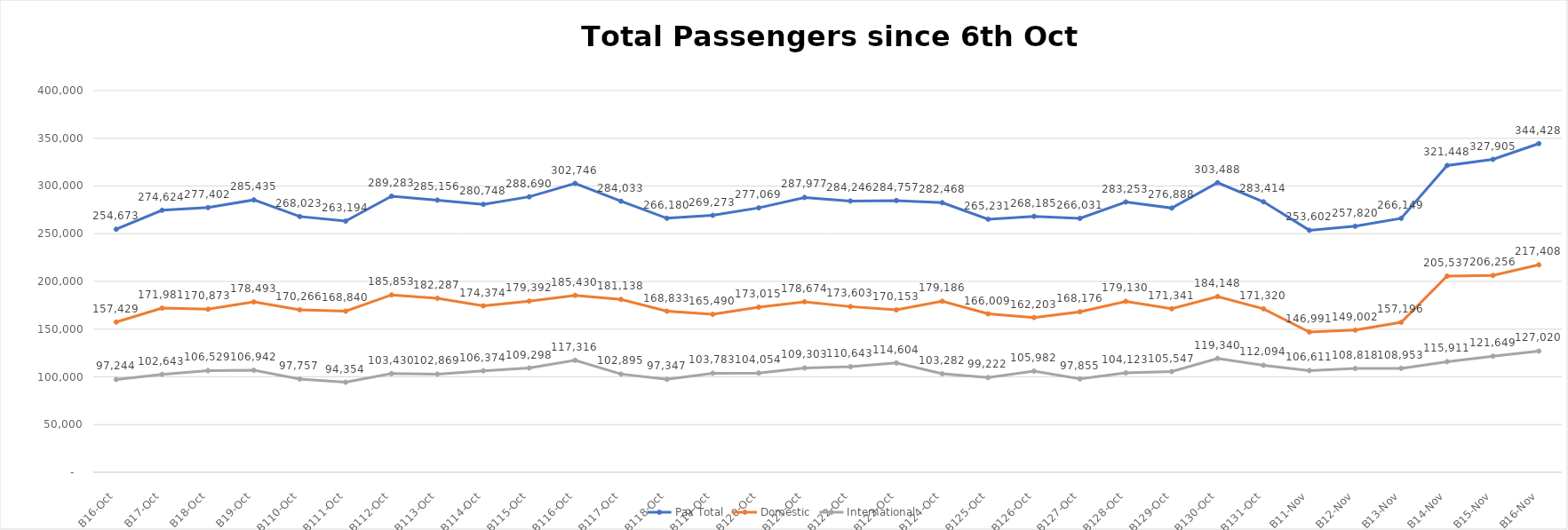
| Category | Pax Total |  Domestic  |  International  |
|---|---|---|---|
| 2022-10-06 | 254673 | 157429 | 97244 |
| 2022-10-07 | 274624 | 171981 | 102643 |
| 2022-10-08 | 277402 | 170873 | 106529 |
| 2022-10-09 | 285435 | 178493 | 106942 |
| 2022-10-10 | 268023 | 170266 | 97757 |
| 2022-10-11 | 263194 | 168840 | 94354 |
| 2022-10-12 | 289283 | 185853 | 103430 |
| 2022-10-13 | 285156 | 182287 | 102869 |
| 2022-10-14 | 280748 | 174374 | 106374 |
| 2022-10-15 | 288690 | 179392 | 109298 |
| 2022-10-16 | 302746 | 185430 | 117316 |
| 2022-10-17 | 284033 | 181138 | 102895 |
| 2022-10-18 | 266180 | 168833 | 97347 |
| 2022-10-19 | 269273 | 165490 | 103783 |
| 2022-10-20 | 277069 | 173015 | 104054 |
| 2022-10-21 | 287977 | 178674 | 109303 |
| 2022-10-22 | 284246 | 173603 | 110643 |
| 2022-10-23 | 284757 | 170153 | 114604 |
| 2022-10-24 | 282468 | 179186 | 103282 |
| 2022-10-25 | 265231 | 166009 | 99222 |
| 2022-10-26 | 268185 | 162203 | 105982 |
| 2022-10-27 | 266031 | 168176 | 97855 |
| 2022-10-28 | 283253 | 179130 | 104123 |
| 2022-10-29 | 276888 | 171341 | 105547 |
| 2022-10-30 | 303488 | 184148 | 119340 |
| 2022-10-31 | 283414 | 171320 | 112094 |
| 2022-11-01 | 253602 | 146991 | 106611 |
| 2022-11-02 | 257820 | 149002 | 108818 |
| 2022-11-03 | 266149 | 157196 | 108953 |
| 2022-11-04 | 321448 | 205537 | 115911 |
| 2022-11-05 | 327905 | 206256 | 121649 |
| 2022-11-06 | 344428 | 217408 | 127020 |